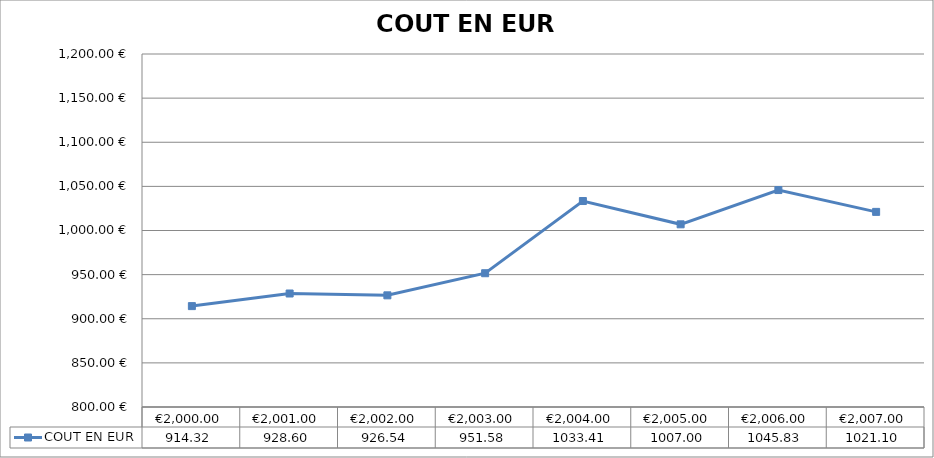
| Category | COUT EN EUR |
|---|---|
| 2000.0 | 914.32 |
| 2001.0 | 928.6 |
| 2002.0 | 926.54 |
| 2003.0 | 951.58 |
| 2004.0 | 1033.41 |
| 2005.0 | 1007 |
| 2006.0 | 1045.83 |
| 2007.0 | 1021.1 |